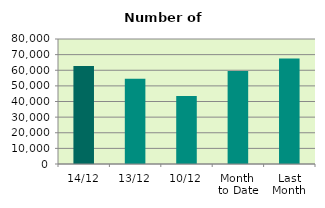
| Category | Series 0 |
|---|---|
| 14/12 | 62656 |
| 13/12 | 54548 |
| 10/12 | 43478 |
| Month 
to Date | 59505.8 |
| Last
Month | 67470.455 |